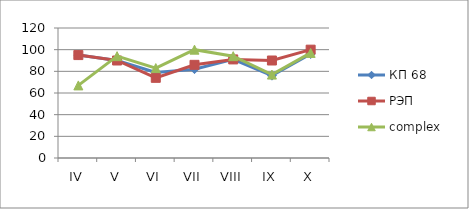
| Category | КП 68 | РЭП  | complex |
|---|---|---|---|
| IV | 95 | 95 | 67 |
| V | 90 | 90 | 94 |
| VI | 79 | 74 | 83 |
| VII | 82 | 86 | 100 |
| VIII | 91 | 91 | 94 |
| IX | 76 | 90 | 77 |
| X | 96 | 100 | 97 |